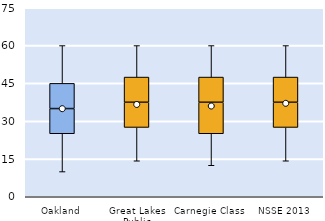
| Category | 25th | 50th | 75th |
|---|---|---|---|
| Oakland | 25 | 10 | 10 |
| Great Lakes Public | 27.5 | 10 | 10 |
| Carnegie Class | 25 | 12.5 | 10 |
| NSSE 2013 | 27.5 | 10 | 10 |